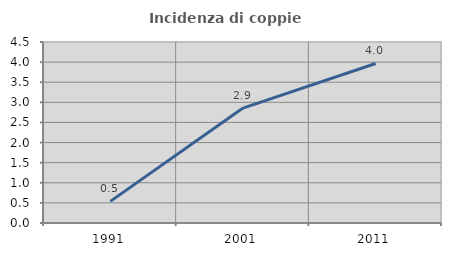
| Category | Incidenza di coppie miste |
|---|---|
| 1991.0 | 0.538 |
| 2001.0 | 2.857 |
| 2011.0 | 3.966 |